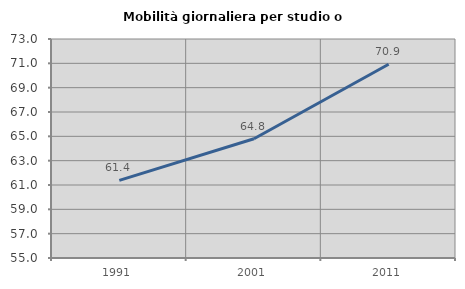
| Category | Mobilità giornaliera per studio o lavoro |
|---|---|
| 1991.0 | 61.375 |
| 2001.0 | 64.804 |
| 2011.0 | 70.928 |